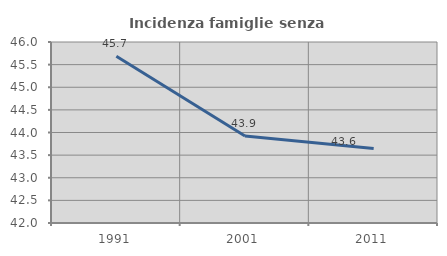
| Category | Incidenza famiglie senza nuclei |
|---|---|
| 1991.0 | 45.683 |
| 2001.0 | 43.922 |
| 2011.0 | 43.644 |